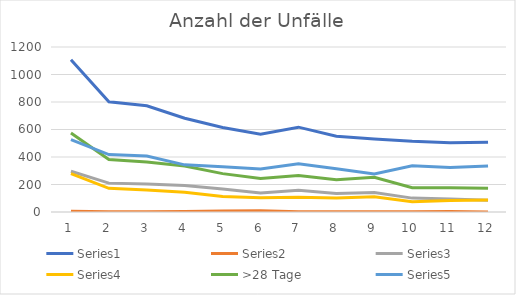
| Category | Series 0 | Series 1 | Series 2 | Series 3 | >28 Tage | Series 4 |
|---|---|---|---|---|---|---|
| 0 | 1107 | 6 | 296 | 279 | 575 | 526 |
| 1 | 802 | 2 | 210 | 172 | 382 | 418 |
| 2 | 773 | 2 | 204 | 160 | 364 | 407 |
| 3 | 682 | 4 | 192 | 143 | 335 | 343 |
| 4 | 615 | 7 | 167 | 112 | 279 | 329 |
| 5 | 565 | 9 | 139 | 104 | 243 | 313 |
| 6 | 617 | 2 | 158 | 107 | 265 | 350 |
| 7 | 551 | 1 | 134 | 101 | 235 | 315 |
| 8 | 531 | 2 | 142 | 111 | 253 | 276 |
| 9 | 514 | 1 | 101 | 75 | 176 | 337 |
| 10 | 504 | 3 | 94 | 83 | 177 | 324 |
| 11 | 507 | 0 | 85 | 88 | 173 | 334 |